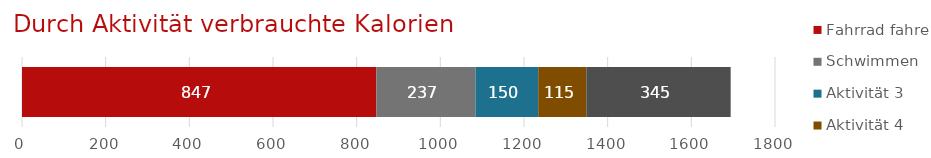
| Category | Fahrrad fahren | Schwimmen | Aktivität 3 | Aktivität 4 | Aktivität 5 |
|---|---|---|---|---|---|
| Aktivitätstracker | 847 | 237 | 150 | 115 | 345 |